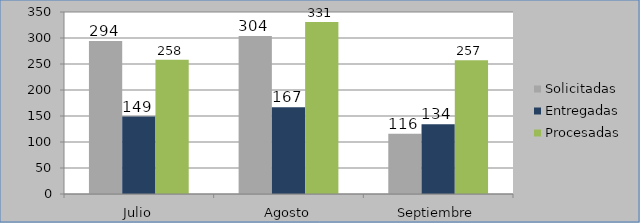
| Category | Solicitadas | Entregadas | Procesadas |
|---|---|---|---|
| Julio | 294 | 149 | 258 |
| Agosto | 304 | 167 | 331 |
| Septiembre | 116 | 134 | 257 |